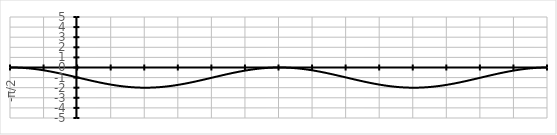
| Category | Series 0 |
|---|---|
| -π/2 | 0 |
|  | 0 |
|  | -0.001 |
|  | -0.001 |
|  | -0.002 |
|  | -0.004 |
|  | -0.005 |
|  | -0.007 |
|  | -0.01 |
|  | -0.012 |
|  | -0.015 |
|  | -0.018 |
|  | -0.022 |
|  | -0.026 |
|  | -0.03 |
|  | -0.034 |
|  | -0.039 |
|  | -0.044 |
|  | -0.049 |
|  | -0.054 |
|  | -0.06 |
|  | -0.066 |
|  | -0.073 |
|  | -0.079 |
|  | -0.086 |
|  | -0.094 |
|  | -0.101 |
|  | -0.109 |
|  | -0.117 |
|  | -0.125 |
|  | -0.134 |
|  | -0.143 |
|  | -0.152 |
|  | -0.161 |
|  | -0.171 |
|  | -0.181 |
|  | -0.191 |
|  | -0.201 |
|  | -0.212 |
|  | -0.223 |
|  | -0.234 |
|  | -0.245 |
|  | -0.257 |
|  | -0.269 |
|  | -0.281 |
|   | -0.293 |
|  | -0.305 |
|  | -0.318 |
|  | -0.331 |
|  | -0.344 |
|  | -0.357 |
|  | -0.371 |
|  | -0.384 |
|  | -0.398 |
|  | -0.412 |
|  | -0.426 |
|  | -0.441 |
|  | -0.455 |
|  | -0.47 |
|  | -0.485 |
|  | -0.5 |
|  | -0.515 |
|  | -0.531 |
|  | -0.546 |
|  | -0.562 |
|  | -0.577 |
|  | -0.593 |
|  | -0.609 |
|  | -0.625 |
|  | -0.642 |
|  | -0.658 |
|  | -0.674 |
|  | -0.691 |
|  | -0.708 |
|  | -0.724 |
|  | -0.741 |
|  | -0.758 |
|  | -0.775 |
|  | -0.792 |
|  | -0.809 |
|  | -0.826 |
|  | -0.844 |
|  | -0.861 |
|  | -0.878 |
|  | -0.895 |
|  | -0.913 |
|  | -0.93 |
|  | -0.948 |
|  | -0.965 |
|  | -0.983 |
| 0 | -1 |
|  | -1.017 |
|  | -1.035 |
|  | -1.052 |
|  | -1.07 |
|  | -1.087 |
|  | -1.105 |
|  | -1.122 |
|  | -1.139 |
|  | -1.156 |
|  | -1.174 |
|  | -1.191 |
|  | -1.208 |
|  | -1.225 |
|  | -1.242 |
|  | -1.259 |
|  | -1.276 |
|  | -1.292 |
|  | -1.309 |
|  | -1.326 |
|  | -1.342 |
|  | -1.358 |
|  | -1.375 |
|  | -1.391 |
|  | -1.407 |
|  | -1.423 |
|  | -1.438 |
|  | -1.454 |
|  | -1.469 |
|  | -1.485 |
|  | -1.5 |
|  | -1.515 |
|  | -1.53 |
|  | -1.545 |
|  | -1.559 |
|  | -1.574 |
|  | -1.588 |
|  | -1.602 |
|  | -1.616 |
|  | -1.629 |
|  | -1.643 |
|  | -1.656 |
|  | -1.669 |
|  | -1.682 |
|  | -1.695 |
|   | -1.707 |
|  | -1.719 |
|  | -1.731 |
|  | -1.743 |
|  | -1.755 |
|  | -1.766 |
|  | -1.777 |
|  | -1.788 |
|  | -1.799 |
|  | -1.809 |
|  | -1.819 |
|  | -1.829 |
|  | -1.839 |
|  | -1.848 |
|  | -1.857 |
|  | -1.866 |
|  | -1.875 |
|  | -1.883 |
|  | -1.891 |
|  | -1.899 |
|  | -1.906 |
|  | -1.914 |
|  | -1.921 |
|  | -1.927 |
|  | -1.934 |
|  | -1.94 |
|  | -1.946 |
|  | -1.951 |
|  | -1.956 |
|  | -1.961 |
|  | -1.966 |
|  | -1.97 |
|  | -1.974 |
|  | -1.978 |
|  | -1.982 |
|  | -1.985 |
|  | -1.988 |
|  | -1.99 |
|  | -1.993 |
|  | -1.995 |
|  | -1.996 |
|  | -1.998 |
|  | -1.999 |
|  | -1.999 |
|  | -2 |
| π/2 | -2 |
|  | -2 |
|  | -1.999 |
|  | -1.999 |
|  | -1.998 |
|  | -1.996 |
|  | -1.995 |
|  | -1.993 |
|  | -1.99 |
|  | -1.988 |
|  | -1.985 |
|  | -1.982 |
|  | -1.978 |
|  | -1.974 |
|  | -1.97 |
|  | -1.966 |
|  | -1.961 |
|  | -1.956 |
|  | -1.951 |
|  | -1.946 |
|  | -1.94 |
|  | -1.934 |
|  | -1.927 |
|  | -1.921 |
|  | -1.914 |
|  | -1.906 |
|  | -1.899 |
|  | -1.891 |
|  | -1.883 |
|  | -1.875 |
|  | -1.866 |
|  | -1.857 |
|  | -1.848 |
|  | -1.839 |
|  | -1.829 |
|  | -1.819 |
|  | -1.809 |
|  | -1.799 |
|  | -1.788 |
|  | -1.777 |
|  | -1.766 |
|  | -1.755 |
|  | -1.743 |
|  | -1.731 |
|  | -1.719 |
|   | -1.707 |
|  | -1.695 |
|  | -1.682 |
|  | -1.669 |
|  | -1.656 |
|  | -1.643 |
|  | -1.629 |
|  | -1.616 |
|  | -1.602 |
|  | -1.588 |
|  | -1.574 |
|  | -1.559 |
|  | -1.545 |
|  | -1.53 |
|  | -1.515 |
|  | -1.5 |
|  | -1.485 |
|  | -1.469 |
|  | -1.454 |
|  | -1.438 |
|  | -1.423 |
|  | -1.407 |
|  | -1.391 |
|  | -1.375 |
|  | -1.358 |
|  | -1.342 |
|  | -1.326 |
|  | -1.309 |
|  | -1.292 |
|  | -1.276 |
|  | -1.259 |
|  | -1.242 |
|  | -1.225 |
|  | -1.208 |
|  | -1.191 |
|  | -1.174 |
|  | -1.156 |
|  | -1.139 |
|  | -1.122 |
|  | -1.105 |
|  | -1.087 |
|  | -1.07 |
|  | -1.052 |
|  | -1.035 |
|  | -1.017 |
| π | -1 |
|  | -0.983 |
|  | -0.965 |
|  | -0.948 |
|  | -0.93 |
|  | -0.913 |
|  | -0.895 |
|  | -0.878 |
|  | -0.861 |
|  | -0.844 |
|  | -0.826 |
|  | -0.809 |
|  | -0.792 |
|  | -0.775 |
|  | -0.758 |
|  | -0.741 |
|  | -0.724 |
|  | -0.708 |
|  | -0.691 |
|  | -0.674 |
|  | -0.658 |
|  | -0.642 |
|  | -0.625 |
|  | -0.609 |
|  | -0.593 |
|  | -0.577 |
|  | -0.562 |
|  | -0.546 |
|  | -0.531 |
|  | -0.515 |
|  | -0.5 |
|  | -0.485 |
|  | -0.47 |
|  | -0.455 |
|  | -0.441 |
|  | -0.426 |
|  | -0.412 |
|  | -0.398 |
|  | -0.384 |
|  | -0.371 |
|  | -0.357 |
|  | -0.344 |
|  | -0.331 |
|  | -0.318 |
|  | -0.305 |
|   | -0.293 |
|  | -0.281 |
|  | -0.269 |
|  | -0.257 |
|  | -0.245 |
|  | -0.234 |
|  | -0.223 |
|  | -0.212 |
|  | -0.201 |
|  | -0.191 |
|  | -0.181 |
|  | -0.171 |
|  | -0.161 |
|  | -0.152 |
|  | -0.143 |
|  | -0.134 |
|  | -0.125 |
|  | -0.117 |
|  | -0.109 |
|  | -0.101 |
|  | -0.094 |
|  | -0.086 |
|  | -0.079 |
|  | -0.073 |
|  | -0.066 |
|  | -0.06 |
|  | -0.054 |
|  | -0.049 |
|  | -0.044 |
|  | -0.039 |
|  | -0.034 |
|  | -0.03 |
|  | -0.026 |
|  | -0.022 |
|  | -0.018 |
|  | -0.015 |
|  | -0.012 |
|  | -0.01 |
|  | -0.007 |
|  | -0.005 |
|  | -0.004 |
|  | -0.002 |
|  | -0.001 |
|  | -0.001 |
|  | 0 |
| 3π/2 | 0 |
|  | 0 |
|  | -0.001 |
|  | -0.001 |
|  | -0.002 |
|  | -0.004 |
|  | -0.005 |
|  | -0.007 |
|  | -0.01 |
|  | -0.012 |
|  | -0.015 |
|  | -0.018 |
|  | -0.022 |
|  | -0.026 |
|  | -0.03 |
|  | -0.034 |
|  | -0.039 |
|  | -0.044 |
|  | -0.049 |
|  | -0.054 |
|  | -0.06 |
|  | -0.066 |
|  | -0.073 |
|  | -0.079 |
|  | -0.086 |
|  | -0.094 |
|  | -0.101 |
|  | -0.109 |
|  | -0.117 |
|  | -0.125 |
|  | -0.134 |
|  | -0.143 |
|  | -0.152 |
|  | -0.161 |
|  | -0.171 |
|  | -0.181 |
|  | -0.191 |
|  | -0.201 |
|  | -0.212 |
|  | -0.223 |
|  | -0.234 |
|  | -0.245 |
|  | -0.257 |
|  | -0.269 |
|  | -0.281 |
|   | -0.293 |
|  | -0.305 |
|  | -0.318 |
|  | -0.331 |
|  | -0.344 |
|  | -0.357 |
|  | -0.371 |
|  | -0.384 |
|  | -0.398 |
|  | -0.412 |
|  | -0.426 |
|  | -0.441 |
|  | -0.455 |
|  | -0.47 |
|  | -0.485 |
|  | -0.5 |
|  | -0.515 |
|  | -0.531 |
|  | -0.546 |
|  | -0.562 |
|  | -0.577 |
|  | -0.593 |
|  | -0.609 |
|  | -0.625 |
|  | -0.642 |
|  | -0.658 |
|  | -0.674 |
|  | -0.691 |
|  | -0.708 |
|  | -0.724 |
|  | -0.741 |
|  | -0.758 |
|  | -0.775 |
|  | -0.792 |
|  | -0.809 |
|  | -0.826 |
|  | -0.844 |
|  | -0.861 |
|  | -0.878 |
|  | -0.895 |
|  | -0.913 |
|  | -0.93 |
|  | -0.948 |
|  | -0.965 |
|  | -0.983 |
| 2π | -1 |
|  | -1.017 |
|  | -1.035 |
|  | -1.052 |
|  | -1.07 |
|  | -1.087 |
|  | -1.105 |
|  | -1.122 |
|  | -1.139 |
|  | -1.156 |
|  | -1.174 |
|  | -1.191 |
|  | -1.208 |
|  | -1.225 |
|  | -1.242 |
|  | -1.259 |
|  | -1.276 |
|  | -1.292 |
|  | -1.309 |
|  | -1.326 |
|  | -1.342 |
|  | -1.358 |
|  | -1.375 |
|  | -1.391 |
|  | -1.407 |
|  | -1.423 |
|  | -1.438 |
|  | -1.454 |
|  | -1.469 |
|  | -1.485 |
|  | -1.5 |
|  | -1.515 |
|  | -1.53 |
|  | -1.545 |
|  | -1.559 |
|  | -1.574 |
|  | -1.588 |
|  | -1.602 |
|  | -1.616 |
|  | -1.629 |
|  | -1.643 |
|  | -1.656 |
|  | -1.669 |
|  | -1.682 |
|  | -1.695 |
|   | -1.707 |
|  | -1.719 |
|  | -1.731 |
|  | -1.743 |
|  | -1.755 |
|  | -1.766 |
|  | -1.777 |
|  | -1.788 |
|  | -1.799 |
|  | -1.809 |
|  | -1.819 |
|  | -1.829 |
|  | -1.839 |
|  | -1.848 |
|  | -1.857 |
|  | -1.866 |
|  | -1.875 |
|  | -1.883 |
|  | -1.891 |
|  | -1.899 |
|  | -1.906 |
|  | -1.914 |
|  | -1.921 |
|  | -1.927 |
|  | -1.934 |
|  | -1.94 |
|  | -1.946 |
|  | -1.951 |
|  | -1.956 |
|  | -1.961 |
|  | -1.966 |
|  | -1.97 |
|  | -1.974 |
|  | -1.978 |
|  | -1.982 |
|  | -1.985 |
|  | -1.988 |
|  | -1.99 |
|  | -1.993 |
|  | -1.995 |
|  | -1.996 |
|  | -1.998 |
|  | -1.999 |
|  | -1.999 |
|  | -2 |
| 5π/2 | -2 |
|  | -2 |
|  | -1.999 |
|  | -1.999 |
|  | -1.998 |
|  | -1.996 |
|  | -1.995 |
|  | -1.993 |
|  | -1.99 |
|  | -1.988 |
|  | -1.985 |
|  | -1.982 |
|  | -1.978 |
|  | -1.974 |
|  | -1.97 |
|  | -1.966 |
|  | -1.961 |
|  | -1.956 |
|  | -1.951 |
|  | -1.946 |
|  | -1.94 |
|  | -1.934 |
|  | -1.927 |
|  | -1.921 |
|  | -1.914 |
|  | -1.906 |
|  | -1.899 |
|  | -1.891 |
|  | -1.883 |
|  | -1.875 |
|  | -1.866 |
|  | -1.857 |
|  | -1.848 |
|  | -1.839 |
|  | -1.829 |
|  | -1.819 |
|  | -1.809 |
|  | -1.799 |
|  | -1.788 |
|  | -1.777 |
|  | -1.766 |
|  | -1.755 |
|  | -1.743 |
|  | -1.731 |
|  | -1.719 |
|   | -1.707 |
|  | -1.695 |
|  | -1.682 |
|  | -1.669 |
|  | -1.656 |
|  | -1.643 |
|  | -1.629 |
|  | -1.616 |
|  | -1.602 |
|  | -1.588 |
|  | -1.574 |
|  | -1.559 |
|  | -1.545 |
|  | -1.53 |
|  | -1.515 |
|  | -1.5 |
|  | -1.485 |
|  | -1.469 |
|  | -1.454 |
|  | -1.438 |
|  | -1.423 |
|  | -1.407 |
|  | -1.391 |
|  | -1.375 |
|  | -1.358 |
|  | -1.342 |
|  | -1.326 |
|  | -1.309 |
|  | -1.292 |
|  | -1.276 |
|  | -1.259 |
|  | -1.242 |
|  | -1.225 |
|  | -1.208 |
|  | -1.191 |
|  | -1.174 |
|  | -1.156 |
|  | -1.139 |
|  | -1.122 |
|  | -1.105 |
|  | -1.087 |
|  | -1.07 |
|  | -1.052 |
|  | -1.035 |
|  | -1.017 |
| 3π | -1 |
|  | -0.983 |
|  | -0.965 |
|  | -0.948 |
|  | -0.93 |
|  | -0.913 |
|  | -0.895 |
|  | -0.878 |
|  | -0.861 |
|  | -0.844 |
|  | -0.826 |
|  | -0.809 |
|  | -0.792 |
|  | -0.775 |
|  | -0.758 |
|  | -0.741 |
|  | -0.724 |
|  | -0.708 |
|  | -0.691 |
|  | -0.674 |
|  | -0.658 |
|  | -0.642 |
|  | -0.625 |
|  | -0.609 |
|  | -0.593 |
|  | -0.577 |
|  | -0.562 |
|  | -0.546 |
|  | -0.531 |
|  | -0.515 |
|  | -0.5 |
|  | -0.485 |
|  | -0.47 |
|  | -0.455 |
|  | -0.441 |
|  | -0.426 |
|  | -0.412 |
|  | -0.398 |
|  | -0.384 |
|  | -0.371 |
|  | -0.357 |
|  | -0.344 |
|  | -0.331 |
|  | -0.318 |
|  | -0.305 |
|   | -0.293 |
|  | -0.281 |
|  | -0.269 |
|  | -0.257 |
|  | -0.245 |
|  | -0.234 |
|  | -0.223 |
|  | -0.212 |
|  | -0.201 |
|  | -0.191 |
|  | -0.181 |
|  | -0.171 |
|  | -0.161 |
|  | -0.152 |
|  | -0.143 |
|  | -0.134 |
|  | -0.125 |
|  | -0.117 |
|  | -0.109 |
|  | -0.101 |
|  | -0.094 |
|  | -0.086 |
|  | -0.079 |
|  | -0.073 |
|  | -0.066 |
|  | -0.06 |
|  | -0.054 |
|  | -0.049 |
|  | -0.044 |
|  | -0.039 |
|  | -0.034 |
|  | -0.03 |
|  | -0.026 |
|  | -0.022 |
|  | -0.018 |
|  | -0.015 |
|  | -0.012 |
|  | -0.01 |
|  | -0.007 |
|  | -0.005 |
|  | -0.004 |
|  | -0.002 |
|  | -0.001 |
|  | -0.001 |
|  | 0 |
| 7π/2 | 0 |